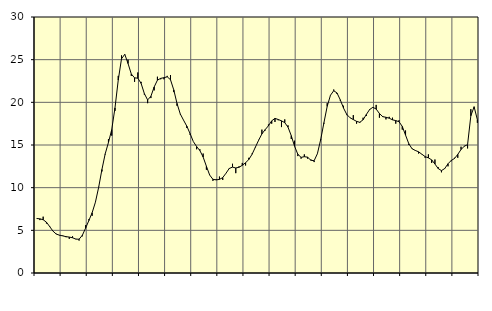
| Category | Piggar | Series 1 |
|---|---|---|
| nan | 6.4 | 6.39 |
| 87.0 | 6.2 | 6.35 |
| 87.0 | 6.6 | 6.24 |
| 87.0 | 5.8 | 5.96 |
| nan | 5.5 | 5.44 |
| 88.0 | 4.9 | 4.91 |
| 88.0 | 4.6 | 4.56 |
| 88.0 | 4.4 | 4.43 |
| nan | 4.4 | 4.35 |
| 89.0 | 4.2 | 4.26 |
| 89.0 | 4 | 4.21 |
| 89.0 | 4.3 | 4.13 |
| nan | 4 | 3.97 |
| 90.0 | 3.8 | 3.96 |
| 90.0 | 4.3 | 4.42 |
| 90.0 | 5.6 | 5.26 |
| nan | 6.3 | 6.15 |
| 91.0 | 6.7 | 7.06 |
| 91.0 | 8.3 | 8.29 |
| 91.0 | 10.1 | 10.04 |
| nan | 11.9 | 12.13 |
| 92.0 | 13.9 | 13.96 |
| 92.0 | 15.7 | 15.3 |
| 92.0 | 16.1 | 16.8 |
| nan | 19 | 19.35 |
| 93.0 | 23.1 | 22.62 |
| 93.0 | 25.5 | 25.1 |
| 93.0 | 25.6 | 25.63 |
| nan | 25 | 24.55 |
| 94.0 | 23.1 | 23.32 |
| 94.0 | 22.4 | 22.87 |
| 94.0 | 23.5 | 22.83 |
| nan | 22.4 | 22.22 |
| 95.0 | 20.9 | 21.02 |
| 95.0 | 19.9 | 20.28 |
| 95.0 | 20.5 | 20.71 |
| nan | 21.4 | 21.8 |
| 96.0 | 23 | 22.6 |
| 96.0 | 22.7 | 22.81 |
| 96.0 | 22.7 | 22.89 |
| nan | 23.1 | 22.99 |
| 97.0 | 23.2 | 22.65 |
| 97.0 | 21.2 | 21.46 |
| 97.0 | 19.6 | 19.87 |
| nan | 18.6 | 18.64 |
| 98.0 | 17.9 | 17.91 |
| 98.0 | 17 | 17.21 |
| 98.0 | 16.2 | 16.34 |
| nan | 15.4 | 15.4 |
| 99.0 | 14.5 | 14.82 |
| 99.0 | 14.5 | 14.35 |
| 99.0 | 14 | 13.59 |
| nan | 12.1 | 12.51 |
| 0.0 | 11.5 | 11.48 |
| 0.0 | 10.8 | 10.98 |
| 0.0 | 11 | 10.91 |
| nan | 11.3 | 10.97 |
| 1.0 | 10.9 | 11.18 |
| 1.0 | 11.7 | 11.69 |
| 1.0 | 12.2 | 12.25 |
| nan | 12.8 | 12.41 |
| 2.0 | 11.7 | 12.31 |
| 2.0 | 12.5 | 12.39 |
| 2.0 | 12.9 | 12.62 |
| nan | 12.6 | 12.92 |
| 3.0 | 13.5 | 13.3 |
| 3.0 | 14 | 13.92 |
| 3.0 | 14.7 | 14.74 |
| nan | 15.6 | 15.56 |
| 4.0 | 16.8 | 16.3 |
| 4.0 | 16.7 | 16.8 |
| 4.0 | 17.4 | 17.25 |
| nan | 17.5 | 17.83 |
| 5.0 | 17.7 | 18.12 |
| 5.0 | 17.9 | 17.99 |
| 5.0 | 17.1 | 17.83 |
| nan | 18 | 17.62 |
| 6.0 | 17.3 | 17.09 |
| 6.0 | 15.7 | 16.09 |
| 6.0 | 15.5 | 14.86 |
| nan | 13.7 | 13.92 |
| 7.0 | 13.4 | 13.55 |
| 7.0 | 13.9 | 13.63 |
| 7.0 | 13.4 | 13.57 |
| nan | 13.3 | 13.21 |
| 8.0 | 13 | 13.16 |
| 8.0 | 14 | 13.98 |
| 8.0 | 15.7 | 15.62 |
| nan | 17.5 | 17.61 |
| 9.0 | 19.9 | 19.53 |
| 9.0 | 20.8 | 20.83 |
| 9.0 | 21.5 | 21.36 |
| nan | 21 | 21.1 |
| 10.0 | 20.2 | 20.3 |
| 10.0 | 19.6 | 19.33 |
| 10.0 | 18.5 | 18.58 |
| nan | 18.2 | 18.19 |
| 11.0 | 18.5 | 17.98 |
| 11.0 | 17.5 | 17.77 |
| 11.0 | 17.6 | 17.66 |
| nan | 18.2 | 17.96 |
| 12.0 | 18.4 | 18.58 |
| 12.0 | 19.1 | 19.16 |
| 12.0 | 19.4 | 19.42 |
| nan | 19.7 | 19.21 |
| 13.0 | 18.2 | 18.69 |
| 13.0 | 18.4 | 18.32 |
| 13.0 | 18 | 18.25 |
| nan | 18.3 | 18.14 |
| 14.0 | 18.2 | 17.95 |
| 14.0 | 17.5 | 17.86 |
| 14.0 | 17.9 | 17.73 |
| nan | 16.8 | 17.18 |
| 15.0 | 16.7 | 16.16 |
| 15.0 | 15 | 15.15 |
| 15.0 | 14.6 | 14.56 |
| nan | 14.4 | 14.36 |
| 16.0 | 14 | 14.2 |
| 16.0 | 13.9 | 13.92 |
| 16.0 | 13.5 | 13.64 |
| nan | 13.9 | 13.49 |
| 17.0 | 12.9 | 13.26 |
| 17.0 | 13.3 | 12.77 |
| 17.0 | 12.4 | 12.24 |
| nan | 11.8 | 12 |
| 18.0 | 12.2 | 12.24 |
| 18.0 | 12.5 | 12.8 |
| 18.0 | 13.1 | 13.19 |
| nan | 13.5 | 13.42 |
| 19.0 | 13.5 | 13.9 |
| 19.0 | 14.8 | 14.47 |
| 19.0 | 14.9 | 14.86 |
| nan | 14.6 | 15.04 |
| 20.0 | 19.2 | 18.42 |
| 20.0 | 19.4 | 19.48 |
| 20.0 | 17.6 | 17.97 |